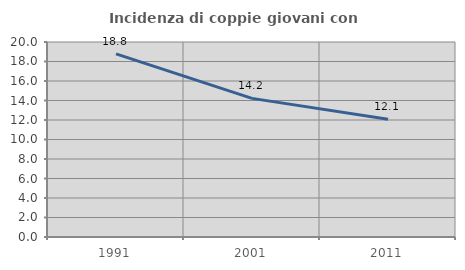
| Category | Incidenza di coppie giovani con figli |
|---|---|
| 1991.0 | 18.789 |
| 2001.0 | 14.218 |
| 2011.0 | 12.074 |